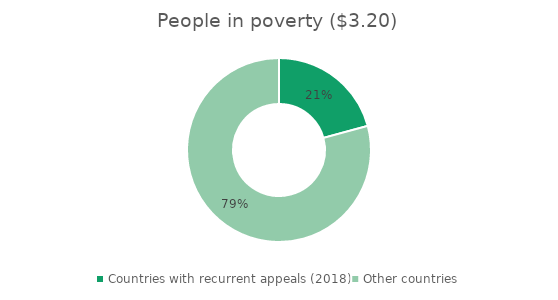
| Category | $3.20 poverty line |
|---|---|
| Countries with recurrent appeals (2018) | 375.922 |
| Other countries | 1433.584 |